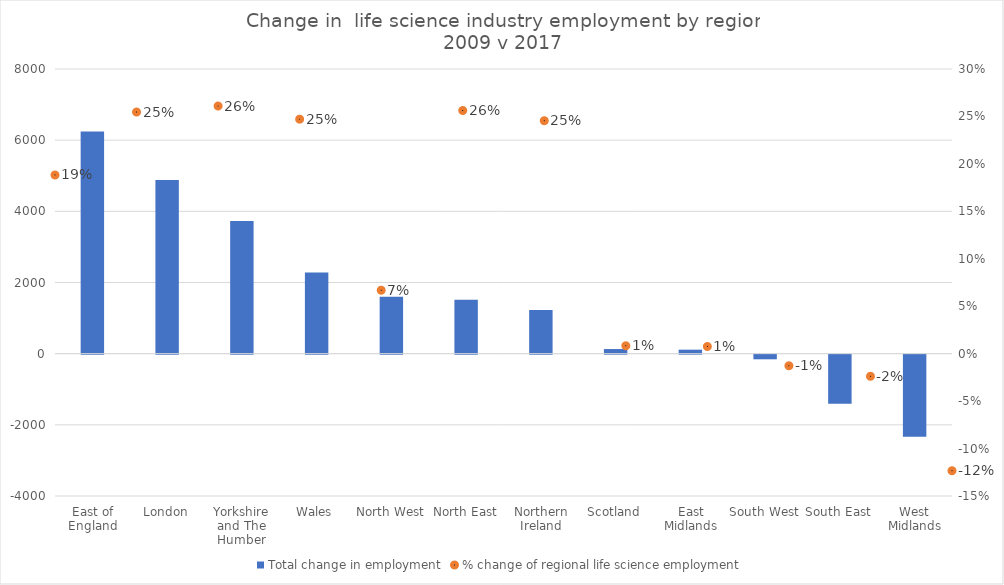
| Category | Total change in employment |
|---|---|
| East of England | 6244 |
| London | 4883 |
| Yorkshire and The Humber | 3730 |
| Wales | 2280 |
| North West | 1598 |
| North East | 1515 |
| Northern Ireland | 1228 |
| Scotland | 130 |
| East Midlands | 112 |
| South West | -130 |
| South East | -1380 |
| West Midlands | -2307 |